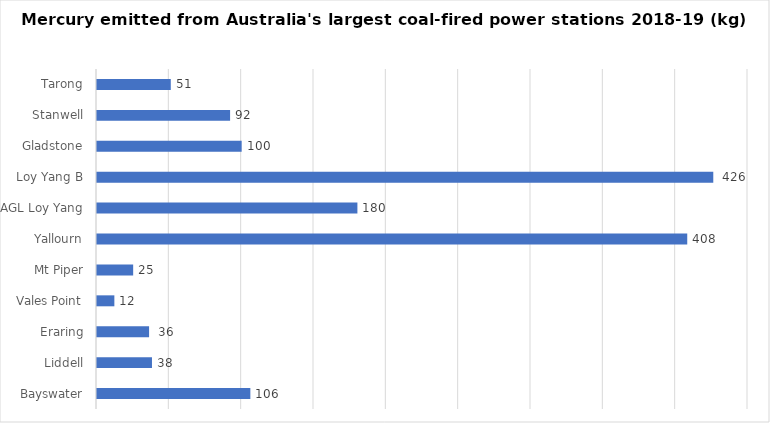
| Category | Series 0 |
|---|---|
| Bayswater | 106 |
| Liddell | 38 |
|  Eraring  | 36 |
| Vales Point | 12 |
| Mt Piper | 25 |
| Yallourn | 408 |
| AGL Loy Yang | 180 |
|  Loy Yang B  | 426 |
| Gladstone | 100 |
| Stanwell | 92 |
| Tarong | 51 |